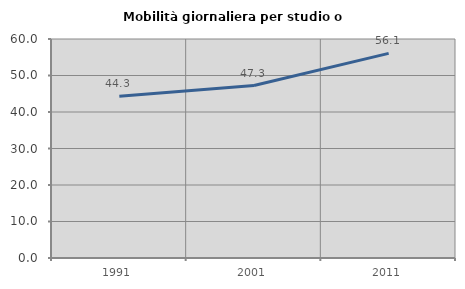
| Category | Mobilità giornaliera per studio o lavoro |
|---|---|
| 1991.0 | 44.299 |
| 2001.0 | 47.256 |
| 2011.0 | 56.053 |